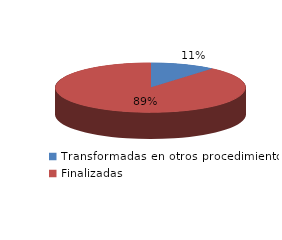
| Category | Series 0 |
|---|---|
| Transformadas en otros procedimientos | 402 |
| Finalizadas | 3222 |